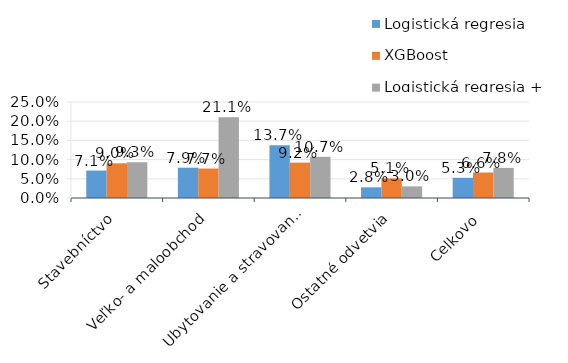
| Category | Logistická regresia | XGBoost | Logistická regresia + XGBoost |
|---|---|---|---|
| Stavebníctvo | 0.071 | 0.09 | 0.093 |
| Veľko- a maloobchod | 0.079 | 0.077 | 0.211 |
| Ubytovanie a stravovanie | 0.137 | 0.092 | 0.107 |
| Ostatné odvetvia | 0.028 | 0.051 | 0.03 |
| Celkovo | 0.053 | 0.066 | 0.078 |